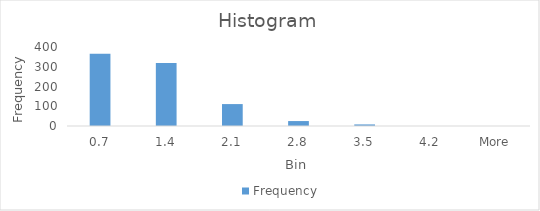
| Category | Frequency |
|---|---|
| 0.7 | 366 |
| 1.4 | 319 |
| 2.1 | 111 |
| 2.8 | 25 |
| 3.5 | 8 |
| 4.2 | 0 |
| More | 0 |